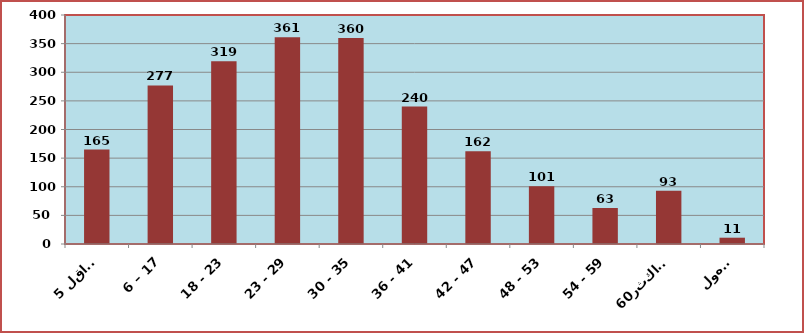
| Category | Series 0 |
|---|---|
| 5 فاقل | 165 |
| 6 – 17 | 277 |
| 18 - 23 | 319 |
| 23 - 29 | 361 |
| 30 - 35 | 360 |
| 36 - 41 | 240 |
| 42 - 47 | 162 |
| 48 - 53 | 101 |
| 54 - 59 | 63 |
|   فاكثر60 | 93 |
|  مجهول | 11 |